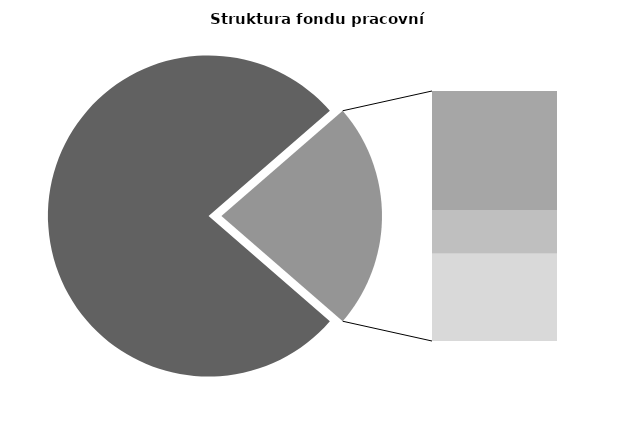
| Category | Series 0 |
|---|---|
| Průměrná měsíční odpracovaná doba bez přesčasu | 133.632 |
| Dovolená | 18.713 |
| Nemoc | 6.92 |
| Jiné | 13.717 |